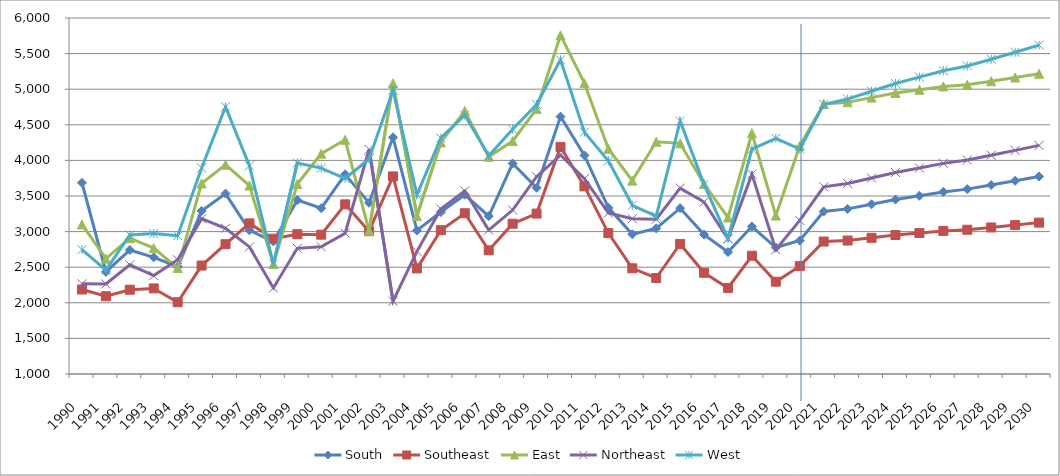
| Category |  South  | Southeast | East | Northeast | West |
|---|---|---|---|---|---|
| 1990.0 | 3686 | 2187 | 3101 | 2268 | 2746 |
| 1991.0 | 2434 | 2092 | 2620 | 2264 | 2458 |
| 1992.0 | 2742 | 2184 | 2907 | 2533 | 2953 |
| 1993.0 | 2639 | 2202 | 2768 | 2382 | 2973 |
| 1994.0 | 2507 | 2008 | 2488 | 2604 | 2943 |
| 1995.0 | 3290 | 2523 | 3676 | 3181 | 3893 |
| 1996.0 | 3534 | 2823 | 3940 | 3047 | 4752 |
| 1997.0 | 3019 | 3115 | 3647 | 2785 | 3924 |
| 1998.0 | 2861.744 | 2900.2 | 2545.1 | 2208.98 | 2543.976 |
| 1999.0 | 3441.225 | 2963.245 | 3668.107 | 2765.101 | 3964.321 |
| 2000.0 | 3328.282 | 2957 | 4093.498 | 2786.1 | 3892.12 |
| 2001.0 | 3804.173 | 3382.445 | 4289.452 | 2977.332 | 3745.598 |
| 2002.0 | 3403.77 | 3005.794 | 3011.792 | 4155.838 | 4019.806 |
| 2003.0 | 4323.867 | 3775.017 | 5081.616 | 2022.432 | 4987.066 |
| 2004.0 | 3015.68 | 2482.93 | 3217.91 | 2722.76 | 3514.85 |
| 2005.0 | 3274.43 | 3019.86 | 4252.75 | 3317.23 | 4314.9 |
| 2006.0 | 3518.49 | 3257.56 | 4694.87 | 3571.62 | 4636.46 |
| 2007.0 | 3216.96 | 2737.29 | 4049.94 | 3022.03 | 4065.84 |
| 2008.0 | 3956.62 | 3110.93 | 4270.76 | 3302.63 | 4437.5 |
| 2009.0 | 3615.59 | 3253.15 | 4722.86 | 3770.87 | 4784.62 |
| 2010.0 | 4615.39 | 4190.38 | 5757.53 | 4075.55 | 5412.028 |
| 2011.0 | 4070.62 | 3635.44 | 5084.25 | 3742.93 | 4396.916 |
| 2012.0 | 3336.93 | 2979.47 | 4163.58 | 3262.19 | 3993.705 |
| 2013.0 | 2962.69 | 2484.38 | 3715.76 | 3180.06 | 3369.36 |
| 2014.0 | 3044.99 | 2348.25 | 4261.35 | 3173.31 | 3216.92 |
| 2015.0 | 3328.4 | 2826.07 | 4239.21 | 3611.03 | 4552.01 |
| 2016.0 | 2957.943 | 2421.638 | 3670.076 | 3415.668 | 3663.676 |
| 2017.0 | 2712.794 | 2208.648 | 3198.058 | 2898.652 | 2903.849 |
| 2018.0 | 3070.604 | 2660.633 | 4381.203 | 3806.776 | 4157.785 |
| 2019.0 | 2776.147 | 2296.141 | 3225.396 | 2747.177 | 4310.14 |
| 2020.0 | 2874.709 | 2514.656 | 4202.903 | 3156.747 | 4160.137 |
| 2021.0 | 3282.319 | 2860.186 | 4792.173 | 3628.863 | 4785.418 |
| 2022.0 | 3319.004 | 2874.429 | 4817.962 | 3675.875 | 4861.235 |
| 2023.0 | 3383.828 | 2912.439 | 4881.755 | 3752.365 | 4971.123 |
| 2024.0 | 3450.167 | 2952.196 | 4946.994 | 3830.418 | 5080.607 |
| 2025.0 | 3503.024 | 2980.435 | 4992.245 | 3893.457 | 5169.217 |
| 2026.0 | 3557.498 | 3009.767 | 5038.986 | 3958.111 | 5259.657 |
| 2027.0 | 3596.503 | 3026.087 | 5062.983 | 4005.252 | 5326.832 |
| 2028.0 | 3654.083 | 3058.091 | 5112.746 | 4072.511 | 5421.233 |
| 2029.0 | 3713.525 | 3091.469 | 5164.467 | 4141.208 | 5518.629 |
| 2030.0 | 3774.458 | 3126.136 | 5217.554 | 4210.952 | 5618.523 |